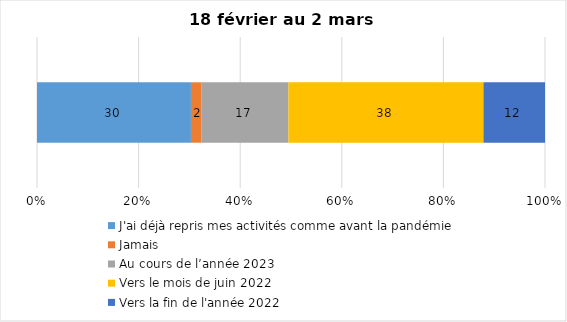
| Category | J'ai déjà repris mes activités comme avant la pandémie | Jamais | Au cours de l’année 2023 | Vers le mois de juin 2022 | Vers la fin de l'année 2022 |
|---|---|---|---|---|---|
| 0 | 30 | 2 | 17 | 38 | 12 |